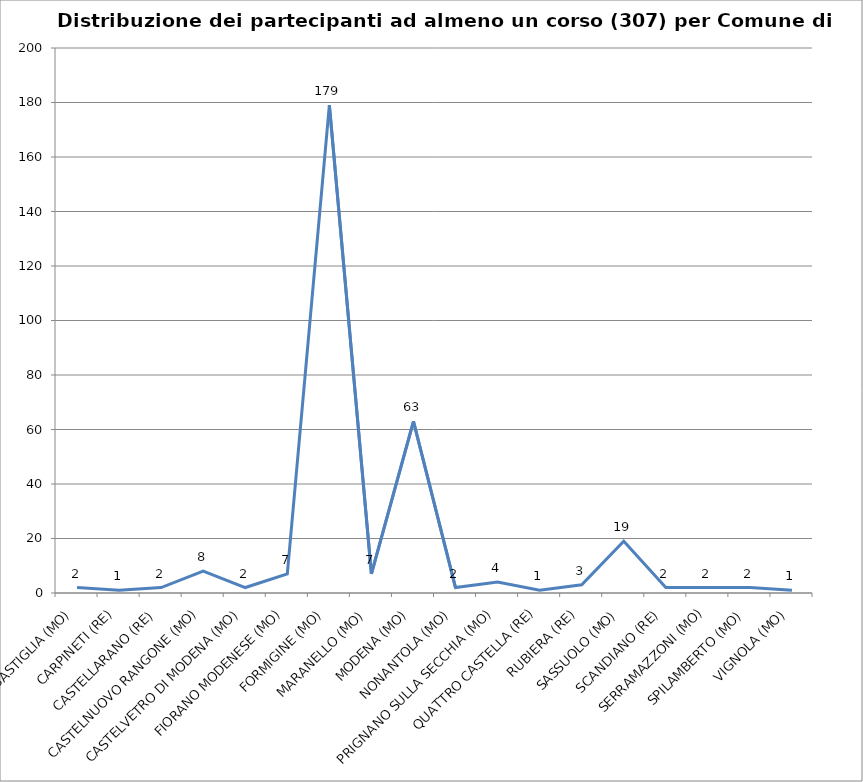
| Category | Nr. Tesserati |
|---|---|
| BASTIGLIA (MO) | 2 |
| CARPINETI (RE) | 1 |
| CASTELLARANO (RE) | 2 |
| CASTELNUOVO RANGONE (MO) | 8 |
| CASTELVETRO DI MODENA (MO) | 2 |
| FIORANO MODENESE (MO) | 7 |
| FORMIGINE (MO) | 179 |
| MARANELLO (MO) | 7 |
| MODENA (MO) | 63 |
| NONANTOLA (MO) | 2 |
| PRIGNANO SULLA SECCHIA (MO) | 4 |
| QUATTRO CASTELLA (RE) | 1 |
| RUBIERA (RE) | 3 |
| SASSUOLO (MO) | 19 |
| SCANDIANO (RE) | 2 |
| SERRAMAZZONI (MO) | 2 |
| SPILAMBERTO (MO) | 2 |
| VIGNOLA (MO) | 1 |